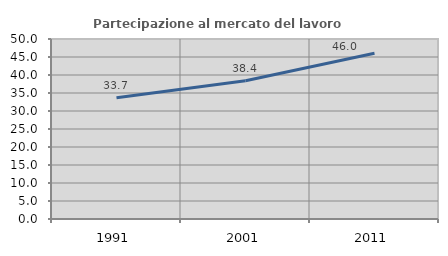
| Category | Partecipazione al mercato del lavoro  femminile |
|---|---|
| 1991.0 | 33.706 |
| 2001.0 | 38.424 |
| 2011.0 | 46.036 |